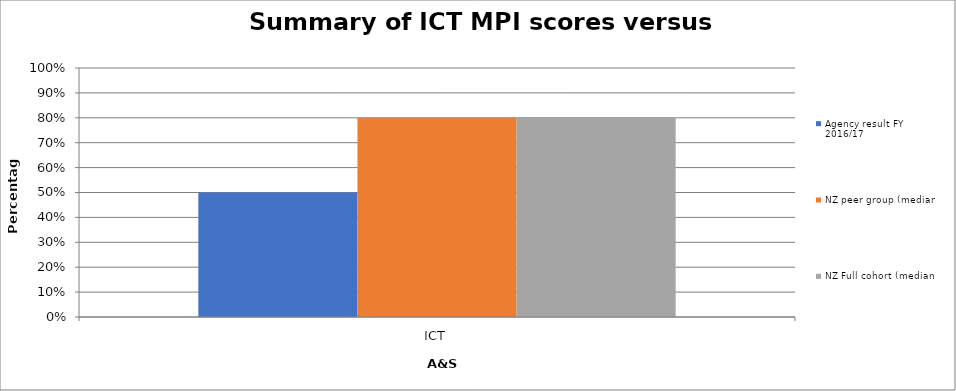
| Category | Agency result FY 2016/17  | NZ peer group (median) | NZ Full cohort (median) |
|---|---|---|---|
| ICT | 0.5 | 0.8 | 0.8 |